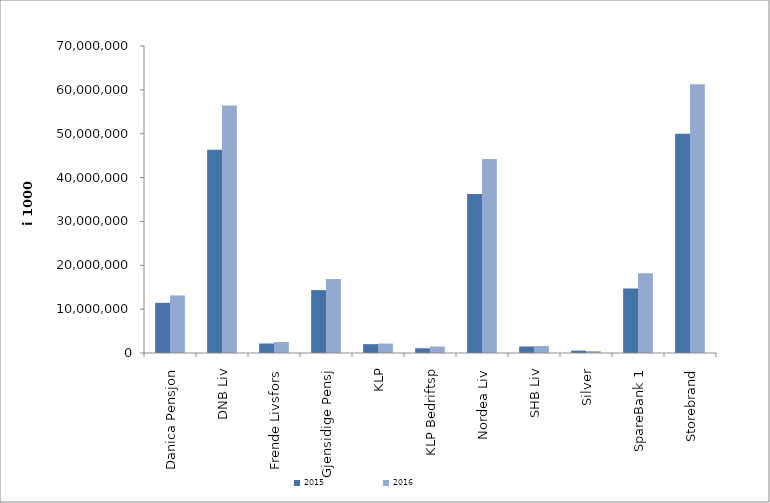
| Category | 2015 | 2016 |
|---|---|---|
| 0 | 11447565.979 | 13128957.816 |
| 1 | 46343617 | 56416731 |
| 2 | 2168094 | 2500425 |
| 3 | 14343893.97 | 16856721.399 |
| 4 | 2015457.339 | 2160404.796 |
| 5 | 1081189 | 1486637 |
| 6 | 36260930.546 | 44252990 |
| 7 | 1490697 | 1612357 |
| 8 | 549829.276 | 432248.263 |
| 9 | 14689551.259 | 18158905.377 |
| 10 | 50010054.028 | 61277517.591 |